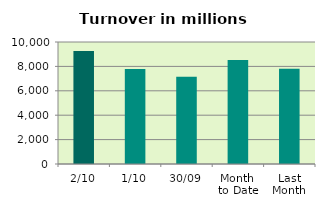
| Category | Series 0 |
|---|---|
| 2/10 | 9252.232 |
| 1/10 | 7795.369 |
| 30/09 | 7151.94 |
| Month 
to Date | 8523.8 |
| Last
Month | 7802.515 |